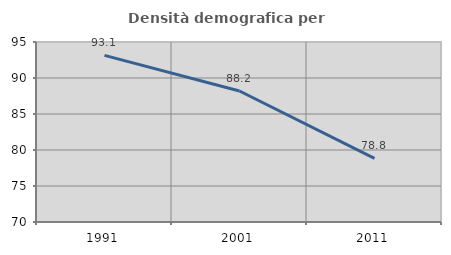
| Category | Densità demografica |
|---|---|
| 1991.0 | 93.136 |
| 2001.0 | 88.191 |
| 2011.0 | 78.849 |